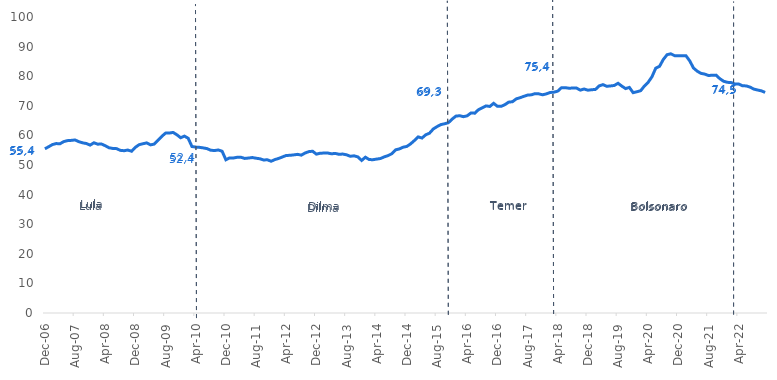
| Category | Dívida bruta do governo geral (% PIB) |
|---|---|
| 2006-12-01 | 55.48 |
| 2007-01-01 | 56.17 |
| 2007-02-01 | 56.9 |
| 2007-03-01 | 57.24 |
| 2007-04-01 | 57.17 |
| 2007-05-01 | 57.91 |
| 2007-06-01 | 58.23 |
| 2007-07-01 | 58.32 |
| 2007-08-01 | 58.46 |
| 2007-09-01 | 57.88 |
| 2007-10-01 | 57.49 |
| 2007-11-01 | 57.26 |
| 2007-12-01 | 56.72 |
| 2008-01-01 | 57.51 |
| 2008-02-01 | 57.04 |
| 2008-03-01 | 57.09 |
| 2008-04-01 | 56.52 |
| 2008-05-01 | 55.82 |
| 2008-06-01 | 55.6 |
| 2008-07-01 | 55.53 |
| 2008-08-01 | 54.95 |
| 2008-09-01 | 54.83 |
| 2008-10-01 | 55.05 |
| 2008-11-01 | 54.64 |
| 2008-12-01 | 55.98 |
| 2009-01-01 | 56.87 |
| 2009-02-01 | 57.18 |
| 2009-03-01 | 57.47 |
| 2009-04-01 | 56.8 |
| 2009-05-01 | 57.07 |
| 2009-06-01 | 58.34 |
| 2009-07-01 | 59.68 |
| 2009-08-01 | 60.77 |
| 2009-09-01 | 60.8 |
| 2009-10-01 | 61 |
| 2009-11-01 | 60.22 |
| 2009-12-01 | 59.21 |
| 2010-01-01 | 59.76 |
| 2010-02-01 | 59.03 |
| 2010-03-01 | 56.24 |
| 2010-04-01 | 56.05 |
| 2010-05-01 | 55.96 |
| 2010-06-01 | 55.78 |
| 2010-07-01 | 55.53 |
| 2010-08-01 | 54.98 |
| 2010-09-01 | 54.89 |
| 2010-10-01 | 55.07 |
| 2010-11-01 | 54.65 |
| 2010-12-01 | 51.77 |
| 2011-01-01 | 52.4 |
| 2011-02-01 | 52.37 |
| 2011-03-01 | 52.61 |
| 2011-04-01 | 52.61 |
| 2011-05-01 | 52.22 |
| 2011-06-01 | 52.35 |
| 2011-07-01 | 52.52 |
| 2011-08-01 | 52.29 |
| 2011-09-01 | 52.11 |
| 2011-10-01 | 51.7 |
| 2011-11-01 | 51.76 |
| 2011-12-01 | 51.27 |
| 2012-01-01 | 51.83 |
| 2012-02-01 | 52.22 |
| 2012-03-01 | 52.72 |
| 2012-04-01 | 53.22 |
| 2012-05-01 | 53.27 |
| 2012-06-01 | 53.42 |
| 2012-07-01 | 53.6 |
| 2012-08-01 | 53.33 |
| 2012-09-01 | 54.05 |
| 2012-10-01 | 54.52 |
| 2012-11-01 | 54.65 |
| 2012-12-01 | 53.67 |
| 2013-01-01 | 53.98 |
| 2013-02-01 | 54.03 |
| 2013-03-01 | 54.05 |
| 2013-04-01 | 53.78 |
| 2013-05-01 | 53.92 |
| 2013-06-01 | 53.61 |
| 2013-07-01 | 53.7 |
| 2013-08-01 | 53.44 |
| 2013-09-01 | 52.95 |
| 2013-10-01 | 53.1 |
| 2013-11-01 | 52.73 |
| 2013-12-01 | 51.54 |
| 2014-01-01 | 52.63 |
| 2014-02-01 | 51.84 |
| 2014-03-01 | 51.79 |
| 2014-04-01 | 52 |
| 2014-05-01 | 52.19 |
| 2014-06-01 | 52.75 |
| 2014-07-01 | 53.17 |
| 2014-08-01 | 53.81 |
| 2014-09-01 | 55.11 |
| 2014-10-01 | 55.43 |
| 2014-11-01 | 56.01 |
| 2014-12-01 | 56.28 |
| 2015-01-01 | 57.16 |
| 2015-02-01 | 58.28 |
| 2015-03-01 | 59.49 |
| 2015-04-01 | 59.11 |
| 2015-05-01 | 60.2 |
| 2015-06-01 | 60.75 |
| 2015-07-01 | 62.17 |
| 2015-08-01 | 62.97 |
| 2015-09-01 | 63.65 |
| 2015-10-01 | 63.93 |
| 2015-11-01 | 64.28 |
| 2015-12-01 | 65.5 |
| 2016-01-01 | 66.51 |
| 2016-02-01 | 66.65 |
| 2016-03-01 | 66.33 |
| 2016-04-01 | 66.62 |
| 2016-05-01 | 67.58 |
| 2016-06-01 | 67.51 |
| 2016-07-01 | 68.7 |
| 2016-08-01 | 69.33 |
| 2016-09-01 | 69.97 |
| 2016-10-01 | 69.78 |
| 2016-11-01 | 70.83 |
| 2016-12-01 | 69.84 |
| 2017-01-01 | 69.81 |
| 2017-02-01 | 70.39 |
| 2017-03-01 | 71.24 |
| 2017-04-01 | 71.38 |
| 2017-05-01 | 72.33 |
| 2017-06-01 | 72.74 |
| 2017-07-01 | 73.18 |
| 2017-08-01 | 73.62 |
| 2017-09-01 | 73.71 |
| 2017-10-01 | 74.11 |
| 2017-11-01 | 74.03 |
| 2017-12-01 | 73.72 |
| 2018-01-01 | 74.03 |
| 2018-02-01 | 74.5 |
| 2018-03-01 | 74.6 |
| 2018-04-01 | 74.95 |
| 2018-05-01 | 76.12 |
| 2018-06-01 | 76.12 |
| 2018-07-01 | 75.94 |
| 2018-08-01 | 76 |
| 2018-09-01 | 75.98 |
| 2018-10-01 | 75.29 |
| 2018-11-01 | 75.68 |
| 2018-12-01 | 75.27 |
| 2019-01-01 | 75.43 |
| 2019-02-01 | 75.53 |
| 2019-03-01 | 76.73 |
| 2019-04-01 | 77.15 |
| 2019-05-01 | 76.59 |
| 2019-06-01 | 76.71 |
| 2019-07-01 | 76.87 |
| 2019-08-01 | 77.61 |
| 2019-09-01 | 76.64 |
| 2019-10-01 | 75.82 |
| 2019-11-01 | 76.21 |
| 2019-12-01 | 74.44 |
| 2020-01-01 | 74.74 |
| 2020-02-01 | 75.11 |
| 2020-03-01 | 76.71 |
| 2020-04-01 | 77.96 |
| 2020-05-01 | 79.83 |
| 2020-06-01 | 82.72 |
| 2020-07-01 | 83.33 |
| 2020-08-01 | 85.65 |
| 2020-09-01 | 87.26 |
| 2020-10-01 | 87.57 |
| 2020-11-01 | 86.93 |
| 2020-12-01 | 86.94 |
| 2021-01-01 | 86.92 |
| 2021-02-01 | 86.91 |
| 2021-03-01 | 85.2 |
| 2021-04-01 | 82.78 |
| 2021-05-01 | 81.69 |
| 2021-06-01 | 80.95 |
| 2021-07-01 | 80.71 |
| 2021-08-01 | 80.22 |
| 2021-09-01 | 80.34 |
| 2021-10-01 | 80.36 |
| 2021-11-01 | 79.15 |
| 2021-12-01 | 78.29 |
| 2022-01-01 | 77.93 |
| 2022-02-01 | 77.85 |
| 2022-03-01 | 77.35 |
| 2022-04-01 | 77.36 |
| 2022-05-01 | 76.76 |
| 2022-06-01 | 76.72 |
| 2022-07-01 | 76.32 |
| 2022-08-01 | 75.65 |
| 2022-09-01 | 75.33 |
| 2022-10-01 | 75.06 |
| 2022-11-01 | 74.52 |